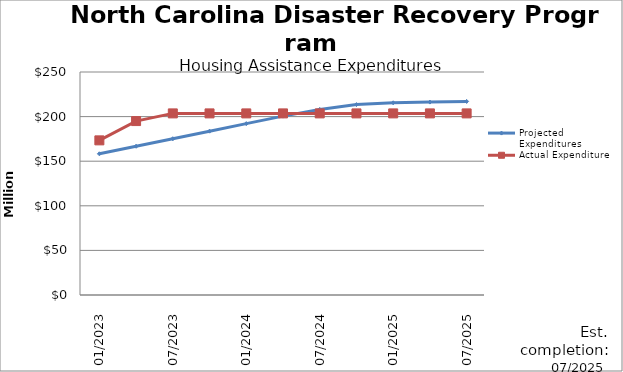
| Category | Projected Expenditures | Actual Expenditure |
|---|---|---|
| 01/2023 | 158292027.785 | 173359061.57 |
| 4/2023 | 166746096.785 | 194989205.57 |
| 07/2023 | 175200167.785 | 203594960.67 |
| 10/2023 | 183654238.785 | 203594960.67 |
| 01/2024 | 192108309.785 | 203594960.67 |
| 4/2024 | 200562380.785 | 203594960.67 |
| 07/2024 | 208016451.785 | 203594960.67 |
| 10/2024 | 213470522.785 | 203594960.67 |
| 01/2025 | 215470522.785 | 203594960.67 |
| 4/2025 | 216265440.785 | 203594960.67 |
| 07/2025 | 217022549.785 | 203594960.67 |